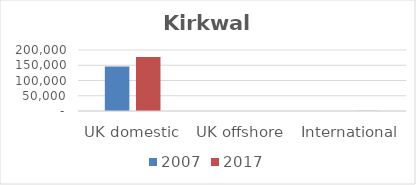
| Category | 2007 | 2017 |
|---|---|---|
| UK domestic | 145899 | 177186 |
| UK offshore | 9 | 16 |
| International | 0 | 505 |